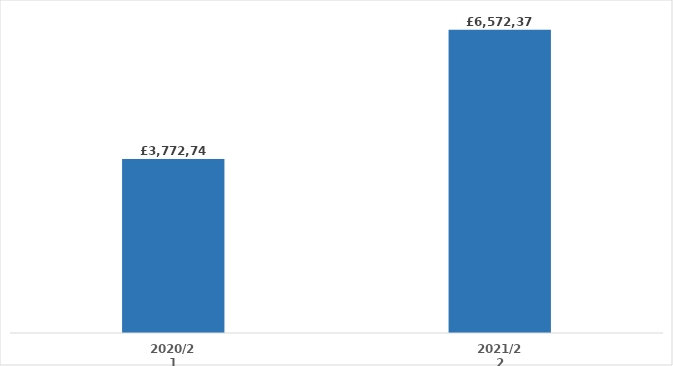
| Category | Series 0 |
|---|---|
| 2020/21 | 3772748 |
| 2021/22 | 6572377.57 |